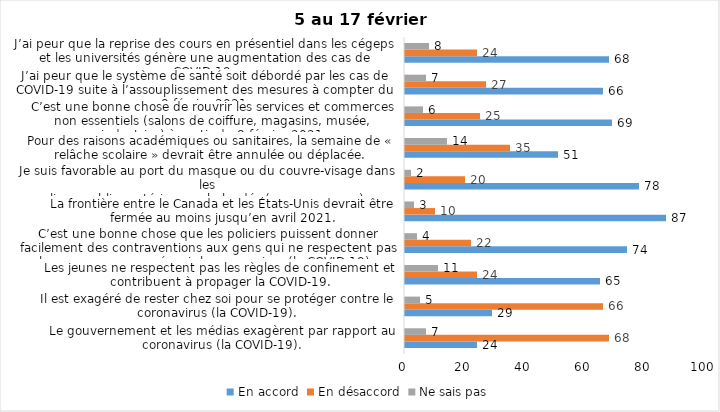
| Category | En accord | En désaccord | Ne sais pas |
|---|---|---|---|
| Le gouvernement et les médias exagèrent par rapport au coronavirus (la COVID-19). | 24 | 68 | 7 |
| Il est exagéré de rester chez soi pour se protéger contre le coronavirus (la COVID-19). | 29 | 66 | 5 |
| Les jeunes ne respectent pas les règles de confinement et contribuent à propager la COVID-19. | 65 | 24 | 11 |
| C’est une bonne chose que les policiers puissent donner facilement des contraventions aux gens qui ne respectent pas les mesures pour prévenir le coronavirus (la COVID-19). | 74 | 22 | 4 |
| La frontière entre le Canada et les États-Unis devrait être fermée au moins jusqu’en avril 2021. | 87 | 10 | 3 |
| Je suis favorable au port du masque ou du couvre-visage dans les
lieux publics extérieurs achalandés (ex. rues, parcs) | 78 | 20 | 2 |
| Pour des raisons académiques ou sanitaires, la semaine de « relâche scolaire » devrait être annulée ou déplacée. | 51 | 35 | 14 |
| C’est une bonne chose de rouvrir les services et commerces non essentiels (salons de coiffure, magasins, musée, industries) à partir du 8 février 2021. | 69 | 25 | 6 |
| J’ai peur que le système de santé soit débordé par les cas de COVID-19 suite à l’assouplissement des mesures à compter du 8 février 2021. | 66 | 27 | 7 |
| J’ai peur que la reprise des cours en présentiel dans les cégeps et les universités génère une augmentation des cas de COVID-19. | 68 | 24 | 8 |